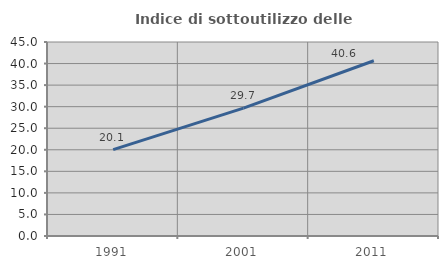
| Category | Indice di sottoutilizzo delle abitazioni  |
|---|---|
| 1991.0 | 20.05 |
| 2001.0 | 29.658 |
| 2011.0 | 40.643 |